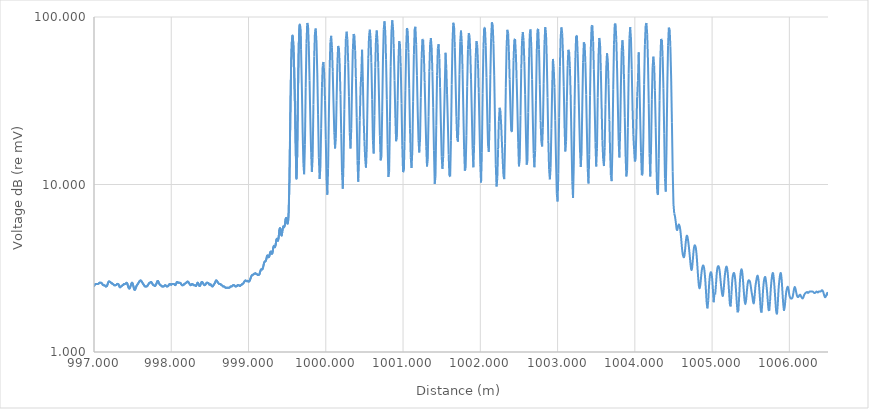
| Category | Series 0 |
|---|---|
| 996.8 | 2.493 |
| 996.81 | 2.464 |
| 996.82 | 2.464 |
| 996.83 | 2.464 |
| 996.84 | 2.477 |
| 996.85 | 2.506 |
| 996.86 | 2.506 |
| 996.87 | 2.493 |
| 996.88 | 2.464 |
| 996.89 | 2.464 |
| 996.9 | 2.464 |
| 996.91 | 2.464 |
| 996.92 | 2.464 |
| 996.93 | 2.464 |
| 996.94 | 2.464 |
| 996.95 | 2.464 |
| 996.96 | 2.477 |
| 996.97 | 2.519 |
| 996.98 | 2.535 |
| 996.99 | 2.493 |
| 997.0 | 2.477 |
| 997.01 | 2.519 |
| 997.02 | 2.548 |
| 997.03 | 2.548 |
| 997.04 | 2.548 |
| 997.05 | 2.548 |
| 997.06 | 2.561 |
| 997.07 | 2.59 |
| 997.08 | 2.59 |
| 997.09 | 2.59 |
| 997.1 | 2.577 |
| 997.11 | 2.535 |
| 997.12 | 2.506 |
| 997.13 | 2.506 |
| 997.14 | 2.493 |
| 997.15 | 2.464 |
| 997.16 | 2.464 |
| 997.17 | 2.49 |
| 997.18 | 2.574 |
| 997.19 | 2.632 |
| 997.2 | 2.632 |
| 997.21 | 2.619 |
| 997.22 | 2.59 |
| 997.23 | 2.577 |
| 997.24 | 2.548 |
| 997.25 | 2.535 |
| 997.26 | 2.506 |
| 997.27 | 2.506 |
| 997.28 | 2.506 |
| 997.29 | 2.519 |
| 997.3 | 2.548 |
| 997.31 | 2.548 |
| 997.32 | 2.522 |
| 997.33 | 2.451 |
| 997.34 | 2.435 |
| 997.35 | 2.464 |
| 997.36 | 2.477 |
| 997.37 | 2.506 |
| 997.38 | 2.519 |
| 997.39 | 2.548 |
| 997.4 | 2.548 |
| 997.41 | 2.561 |
| 997.42 | 2.59 |
| 997.43 | 2.564 |
| 997.44 | 2.48 |
| 997.45 | 2.409 |
| 997.46 | 2.394 |
| 997.47 | 2.449 |
| 997.48 | 2.532 |
| 997.49 | 2.59 |
| 997.5 | 2.564 |
| 997.51 | 2.467 |
| 997.52 | 2.367 |
| 997.53 | 2.352 |
| 997.54 | 2.407 |
| 997.55 | 2.477 |
| 997.56 | 2.519 |
| 997.57 | 2.561 |
| 997.58 | 2.603 |
| 997.59 | 2.645 |
| 997.6 | 2.673 |
| 997.61 | 2.66 |
| 997.62 | 2.619 |
| 997.63 | 2.577 |
| 997.64 | 2.535 |
| 997.65 | 2.493 |
| 997.66 | 2.464 |
| 997.67 | 2.464 |
| 997.68 | 2.464 |
| 997.69 | 2.477 |
| 997.7 | 2.519 |
| 997.71 | 2.561 |
| 997.72 | 2.59 |
| 997.73 | 2.603 |
| 997.74 | 2.619 |
| 997.75 | 2.577 |
| 997.76 | 2.535 |
| 997.77 | 2.506 |
| 997.78 | 2.493 |
| 997.79 | 2.477 |
| 997.8 | 2.519 |
| 997.81 | 2.574 |
| 997.82 | 2.645 |
| 997.83 | 2.647 |
| 997.84 | 2.577 |
| 997.85 | 2.535 |
| 997.86 | 2.506 |
| 997.87 | 2.493 |
| 997.88 | 2.464 |
| 997.89 | 2.464 |
| 997.9 | 2.464 |
| 997.91 | 2.477 |
| 997.92 | 2.506 |
| 997.93 | 2.493 |
| 997.94 | 2.464 |
| 997.95 | 2.464 |
| 997.96 | 2.477 |
| 997.97 | 2.519 |
| 997.98 | 2.548 |
| 997.99 | 2.535 |
| 998.0 | 2.519 |
| 998.01 | 2.548 |
| 998.02 | 2.548 |
| 998.03 | 2.548 |
| 998.04 | 2.535 |
| 998.05 | 2.506 |
| 998.06 | 2.532 |
| 998.07 | 2.603 |
| 998.08 | 2.619 |
| 998.09 | 2.59 |
| 998.1 | 2.59 |
| 998.11 | 2.59 |
| 998.12 | 2.577 |
| 998.13 | 2.535 |
| 998.14 | 2.506 |
| 998.15 | 2.506 |
| 998.16 | 2.519 |
| 998.17 | 2.548 |
| 998.18 | 2.561 |
| 998.19 | 2.59 |
| 998.2 | 2.603 |
| 998.21 | 2.632 |
| 998.22 | 2.619 |
| 998.23 | 2.577 |
| 998.24 | 2.535 |
| 998.25 | 2.506 |
| 998.26 | 2.519 |
| 998.27 | 2.548 |
| 998.28 | 2.535 |
| 998.29 | 2.506 |
| 998.3 | 2.506 |
| 998.31 | 2.493 |
| 998.32 | 2.477 |
| 998.33 | 2.532 |
| 998.34 | 2.59 |
| 998.35 | 2.564 |
| 998.36 | 2.493 |
| 998.37 | 2.477 |
| 998.38 | 2.532 |
| 998.39 | 2.603 |
| 998.4 | 2.619 |
| 998.41 | 2.577 |
| 998.42 | 2.535 |
| 998.43 | 2.506 |
| 998.44 | 2.519 |
| 998.45 | 2.561 |
| 998.46 | 2.59 |
| 998.47 | 2.59 |
| 998.48 | 2.577 |
| 998.49 | 2.535 |
| 998.5 | 2.519 |
| 998.51 | 2.535 |
| 998.52 | 2.493 |
| 998.53 | 2.464 |
| 998.54 | 2.477 |
| 998.55 | 2.519 |
| 998.56 | 2.561 |
| 998.57 | 2.616 |
| 998.58 | 2.673 |
| 998.59 | 2.66 |
| 998.6 | 2.619 |
| 998.61 | 2.577 |
| 998.62 | 2.548 |
| 998.63 | 2.548 |
| 998.64 | 2.535 |
| 998.65 | 2.506 |
| 998.66 | 2.493 |
| 998.67 | 2.464 |
| 998.68 | 2.464 |
| 998.69 | 2.451 |
| 998.7 | 2.422 |
| 998.71 | 2.422 |
| 998.72 | 2.422 |
| 998.73 | 2.422 |
| 998.74 | 2.422 |
| 998.75 | 2.422 |
| 998.76 | 2.435 |
| 998.77 | 2.464 |
| 998.78 | 2.464 |
| 998.79 | 2.477 |
| 998.8 | 2.506 |
| 998.81 | 2.506 |
| 998.82 | 2.493 |
| 998.83 | 2.464 |
| 998.84 | 2.464 |
| 998.85 | 2.477 |
| 998.86 | 2.506 |
| 998.87 | 2.506 |
| 998.88 | 2.493 |
| 998.89 | 2.477 |
| 998.9 | 2.506 |
| 998.91 | 2.519 |
| 998.92 | 2.548 |
| 998.93 | 2.561 |
| 998.94 | 2.603 |
| 998.95 | 2.645 |
| 998.96 | 2.673 |
| 998.97 | 2.66 |
| 998.98 | 2.645 |
| 998.99 | 2.66 |
| 999.0 | 2.632 |
| 999.01 | 2.645 |
| 999.02 | 2.7 |
| 999.03 | 2.783 |
| 999.04 | 2.854 |
| 999.05 | 2.883 |
| 999.06 | 2.896 |
| 999.07 | 2.924 |
| 999.08 | 2.938 |
| 999.09 | 2.953 |
| 999.1 | 2.924 |
| 999.11 | 2.911 |
| 999.12 | 2.883 |
| 999.13 | 2.883 |
| 999.14 | 2.909 |
| 999.15 | 3.006 |
| 999.16 | 3.105 |
| 999.17 | 3.121 |
| 999.18 | 3.118 |
| 999.19 | 3.228 |
| 999.2 | 3.382 |
| 999.21 | 3.468 |
| 999.22 | 3.481 |
| 999.23 | 3.576 |
| 999.24 | 3.746 |
| 999.25 | 3.764 |
| 999.26 | 3.678 |
| 999.27 | 3.743 |
| 999.28 | 3.926 |
| 999.29 | 3.973 |
| 999.3 | 3.861 |
| 999.31 | 3.908 |
| 999.32 | 4.203 |
| 999.33 | 4.308 |
| 999.34 | 4.222 |
| 999.35 | 4.339 |
| 999.36 | 4.663 |
| 999.37 | 4.742 |
| 999.38 | 4.611 |
| 999.39 | 4.836 |
| 999.4 | 5.372 |
| 999.41 | 5.472 |
| 999.42 | 5.079 |
| 999.43 | 4.967 |
| 999.44 | 5.356 |
| 999.45 | 5.618 |
| 999.46 | 5.56 |
| 999.47 | 5.73 |
| 999.48 | 6.209 |
| 999.49 | 6.295 |
| 999.5 | 5.887 |
| 999.51 | 5.882 |
| 999.52 | 6.889 |
| 999.53 | 10.874 |
| 999.54 | 23.853 |
| 999.55 | 47.519 |
| 999.56 | 69.925 |
| 999.57 | 77.616 |
| 999.58 | 68.782 |
| 999.59 | 50.474 |
| 999.6 | 31.41 |
| 999.61 | 17.273 |
| 999.62 | 10.812 |
| 999.63 | 15.132 |
| 999.64 | 35.092 |
| 999.65 | 66.45 |
| 999.66 | 89.12 |
| 999.67 | 86.847 |
| 999.68 | 64.112 |
| 999.69 | 38.317 |
| 999.7 | 21.149 |
| 999.71 | 13.317 |
| 999.72 | 11.507 |
| 999.73 | 17.409 |
| 999.74 | 37.817 |
| 999.75 | 69.475 |
| 999.76 | 92.161 |
| 999.77 | 89.847 |
| 999.78 | 67.213 |
| 999.79 | 41.771 |
| 999.8 | 24.473 |
| 999.81 | 15.566 |
| 999.82 | 11.897 |
| 999.83 | 14.47 |
| 999.84 | 30.051 |
| 999.85 | 58.102 |
| 999.86 | 81.612 |
| 999.87 | 85.411 |
| 999.88 | 69.977 |
| 999.89 | 46.348 |
| 999.9 | 26.039 |
| 999.91 | 14.543 |
| 999.92 | 10.78 |
| 999.93 | 12.561 |
| 999.94 | 21.661 |
| 999.95 | 37.775 |
| 999.96 | 51.342 |
| 999.97 | 53.895 |
| 999.98 | 45.665 |
| 999.99 | 31.667 |
| 1000.0 | 18.594 |
| 1000.01 | 10.796 |
| 1000.02 | 8.688 |
| 1000.03 | 12.435 |
| 1000.04 | 26.008 |
| 1000.05 | 49.799 |
| 1000.06 | 71.478 |
| 1000.07 | 77.187 |
| 1000.08 | 65.927 |
| 1000.09 | 47.132 |
| 1000.1 | 30.597 |
| 1000.11 | 20.49 |
| 1000.12 | 16.397 |
| 1000.13 | 18.787 |
| 1000.14 | 31.871 |
| 1000.15 | 52.938 |
| 1000.16 | 67.203 |
| 1000.17 | 65.432 |
| 1000.18 | 51.664 |
| 1000.19 | 34.402 |
| 1000.2 | 20.181 |
| 1000.21 | 11.839 |
| 1000.22 | 9.423 |
| 1000.23 | 13.628 |
| 1000.24 | 28.1 |
| 1000.25 | 52.26 |
| 1000.26 | 74.117 |
| 1000.27 | 81.745 |
| 1000.28 | 73.068 |
| 1000.29 | 53.581 |
| 1000.3 | 33.395 |
| 1000.31 | 20.424 |
| 1000.32 | 16.382 |
| 1000.33 | 21.661 |
| 1000.34 | 39.232 |
| 1000.35 | 63.644 |
| 1000.36 | 79.106 |
| 1000.37 | 77.462 |
| 1000.38 | 62.822 |
| 1000.39 | 43 |
| 1000.4 | 25.176 |
| 1000.41 | 13.965 |
| 1000.42 | 10.388 |
| 1000.43 | 13.879 |
| 1000.44 | 24.146 |
| 1000.45 | 37.713 |
| 1000.46 | 46.089 |
| 1000.47 | 63.821 |
| 1000.48 | 41.321 |
| 1000.49 | 24.572 |
| 1000.5 | 18.105 |
| 1000.51 | 14.318 |
| 1000.52 | 12.611 |
| 1000.53 | 16.267 |
| 1000.54 | 31.518 |
| 1000.55 | 56.387 |
| 1000.56 | 77.514 |
| 1000.57 | 84.031 |
| 1000.58 | 74.151 |
| 1000.59 | 53.549 |
| 1000.6 | 32.166 |
| 1000.61 | 18.254 |
| 1000.62 | 15.294 |
| 1000.63 | 25.832 |
| 1000.64 | 50.074 |
| 1000.65 | 75.283 |
| 1000.66 | 83.157 |
| 1000.67 | 70.689 |
| 1000.68 | 49.724 |
| 1000.69 | 31.345 |
| 1000.7 | 19.546 |
| 1000.71 | 13.931 |
| 1000.72 | 14.661 |
| 1000.73 | 27.417 |
| 1000.74 | 55.427 |
| 1000.75 | 84.347 |
| 1000.76 | 94.355 |
| 1000.77 | 81.253 |
| 1000.78 | 55.874 |
| 1000.79 | 32.124 |
| 1000.8 | 17.294 |
| 1000.81 | 11.091 |
| 1000.82 | 11.926 |
| 1000.83 | 23.73 |
| 1000.84 | 50.741 |
| 1000.85 | 81.35 |
| 1000.86 | 95.723 |
| 1000.87 | 87.49 |
| 1000.88 | 65.139 |
| 1000.89 | 41.787 |
| 1000.9 | 25.626 |
| 1000.91 | 18.121 |
| 1000.92 | 19.018 |
| 1000.93 | 31.698 |
| 1000.94 | 54.601 |
| 1000.95 | 71.774 |
| 1000.96 | 69.127 |
| 1000.97 | 50.78 |
| 1000.98 | 30.443 |
| 1000.99 | 17.132 |
| 1001.0 | 11.86 |
| 1001.01 | 11.96 |
| 1001.02 | 18.032 |
| 1001.03 | 36.225 |
| 1001.04 | 64.962 |
| 1001.05 | 85.819 |
| 1001.06 | 83.149 |
| 1001.07 | 61.468 |
| 1001.08 | 37.336 |
| 1001.09 | 21.52 |
| 1001.1 | 14.465 |
| 1001.11 | 12.54 |
| 1001.12 | 15.872 |
| 1001.13 | 31.222 |
| 1001.14 | 59.862 |
| 1001.15 | 84.679 |
| 1001.16 | 87.396 |
| 1001.17 | 68.85 |
| 1001.18 | 44.538 |
| 1001.19 | 27.067 |
| 1001.2 | 18.395 |
| 1001.21 | 15.532 |
| 1001.22 | 18.712 |
| 1001.23 | 33.058 |
| 1001.24 | 56.481 |
| 1001.25 | 73.659 |
| 1001.26 | 73.076 |
| 1001.27 | 58.518 |
| 1001.28 | 40.542 |
| 1001.29 | 26.049 |
| 1001.3 | 16.944 |
| 1001.31 | 12.809 |
| 1001.32 | 14.161 |
| 1001.33 | 25.367 |
| 1001.34 | 47.449 |
| 1001.35 | 68.492 |
| 1001.36 | 74.82 |
| 1001.37 | 65.32 |
| 1001.38 | 47.297 |
| 1001.39 | 28.96 |
| 1001.4 | 16.018 |
| 1001.41 | 10.085 |
| 1001.42 | 11.201 |
| 1001.43 | 22.6 |
| 1001.44 | 44.724 |
| 1001.45 | 64.865 |
| 1001.46 | 68.848 |
| 1001.47 | 56.559 |
| 1001.48 | 37.893 |
| 1001.49 | 22.66 |
| 1001.5 | 14.643 |
| 1001.51 | 12.399 |
| 1001.52 | 14.755 |
| 1001.53 | 23.963 |
| 1001.54 | 38.583 |
| 1001.55 | 61.1 |
| 1001.56 | 49.406 |
| 1001.57 | 34.635 |
| 1001.58 | 23.121 |
| 1001.59 | 15.105 |
| 1001.6 | 11.253 |
| 1001.61 | 11.162 |
| 1001.62 | 18.236 |
| 1001.63 | 39.528 |
| 1001.64 | 71.005 |
| 1001.65 | 92.456 |
| 1001.66 | 88.913 |
| 1001.67 | 65.843 |
| 1001.68 | 40.974 |
| 1001.69 | 25.401 |
| 1001.7 | 18.861 |
| 1001.71 | 18.029 |
| 1001.72 | 24.93 |
| 1001.73 | 45.176 |
| 1001.74 | 71.371 |
| 1001.75 | 82.956 |
| 1001.76 | 71.455 |
| 1001.77 | 48.379 |
| 1001.78 | 28.215 |
| 1001.79 | 16.536 |
| 1001.8 | 12.096 |
| 1001.81 | 12.501 |
| 1001.82 | 19.682 |
| 1001.83 | 38.471 |
| 1001.84 | 63.955 |
| 1001.85 | 80.09 |
| 1001.86 | 77.666 |
| 1001.87 | 61.805 |
| 1001.88 | 42.582 |
| 1001.89 | 26.635 |
| 1001.9 | 16.478 |
| 1001.91 | 12.658 |
| 1001.92 | 17.15 |
| 1001.93 | 33.753 |
| 1001.94 | 57.396 |
| 1001.95 | 71.808 |
| 1001.96 | 68.351 |
| 1001.97 | 52.864 |
| 1001.98 | 35.257 |
| 1001.99 | 21.431 |
| 1002.0 | 13.105 |
| 1002.01 | 10.265 |
| 1002.02 | 15.487 |
| 1002.03 | 34.813 |
| 1002.04 | 64.677 |
| 1002.05 | 86.389 |
| 1002.06 | 86.374 |
| 1002.07 | 67.668 |
| 1002.08 | 43.583 |
| 1002.09 | 25.801 |
| 1002.1 | 17.211 |
| 1002.11 | 15.655 |
| 1002.12 | 23.102 |
| 1002.13 | 45.121 |
| 1002.14 | 74.815 |
| 1002.15 | 92.987 |
| 1002.16 | 89.724 |
| 1002.17 | 69.802 |
| 1002.18 | 44.525 |
| 1002.19 | 24.242 |
| 1002.2 | 13.225 |
| 1002.21 | 9.718 |
| 1002.22 | 10.916 |
| 1002.23 | 16.201 |
| 1002.24 | 23.884 |
| 1002.25 | 28.704 |
| 1002.26 | 27.54 |
| 1002.27 | 22.647 |
| 1002.28 | 17.613 |
| 1002.29 | 13.85 |
| 1002.3 | 11.261 |
| 1002.31 | 10.767 |
| 1002.32 | 17.498 |
| 1002.33 | 38 |
| 1002.34 | 66.376 |
| 1002.35 | 83.829 |
| 1002.36 | 80.037 |
| 1002.37 | 61.915 |
| 1002.38 | 42.339 |
| 1002.39 | 28.364 |
| 1002.4 | 20.835 |
| 1002.41 | 20.644 |
| 1002.42 | 32.42 |
| 1002.43 | 55.108 |
| 1002.44 | 73.353 |
| 1002.45 | 73.963 |
| 1002.46 | 60.393 |
| 1002.47 | 43.123 |
| 1002.48 | 28.223 |
| 1002.49 | 17.904 |
| 1002.5 | 12.83 |
| 1002.51 | 14.057 |
| 1002.52 | 25.819 |
| 1002.53 | 49.274 |
| 1002.54 | 72.645 |
| 1002.55 | 81.348 |
| 1002.56 | 72.637 |
| 1002.57 | 54.012 |
| 1002.58 | 34.606 |
| 1002.59 | 20.372 |
| 1002.6 | 13.131 |
| 1002.61 | 13.808 |
| 1002.62 | 26.939 |
| 1002.63 | 53.821 |
| 1002.64 | 79.441 |
| 1002.65 | 84.347 |
| 1002.66 | 67.009 |
| 1002.67 | 42.409 |
| 1002.68 | 24.188 |
| 1002.69 | 15.336 |
| 1002.7 | 12.684 |
| 1002.71 | 15.963 |
| 1002.72 | 31.567 |
| 1002.73 | 60.231 |
| 1002.74 | 84.284 |
| 1002.75 | 84.849 |
| 1002.76 | 63.923 |
| 1002.77 | 39.368 |
| 1002.78 | 24.075 |
| 1002.79 | 18.076 |
| 1002.8 | 16.876 |
| 1002.81 | 21.837 |
| 1002.82 | 40.286 |
| 1002.83 | 68.769 |
| 1002.84 | 86.978 |
| 1002.85 | 80.589 |
| 1002.86 | 56.839 |
| 1002.87 | 33.029 |
| 1002.88 | 18.387 |
| 1002.89 | 12.289 |
| 1002.9 | 10.733 |
| 1002.91 | 12.582 |
| 1002.92 | 21.504 |
| 1002.93 | 37.668 |
| 1002.94 | 56.215 |
| 1002.95 | 49.494 |
| 1002.96 | 37.961 |
| 1002.97 | 24.038 |
| 1002.98 | 13.811 |
| 1002.99 | 8.821 |
| 1003.0 | 7.919 |
| 1003.01 | 11.58 |
| 1003.02 | 25.189 |
| 1003.03 | 50.712 |
| 1003.04 | 75.981 |
| 1003.05 | 86.722 |
| 1003.06 | 79.682 |
| 1003.07 | 60.202 |
| 1003.08 | 38.387 |
| 1003.09 | 22.676 |
| 1003.1 | 15.754 |
| 1003.11 | 17.99 |
| 1003.12 | 31.384 |
| 1003.13 | 51.227 |
| 1003.14 | 63.704 |
| 1003.15 | 61.834 |
| 1003.16 | 49.313 |
| 1003.17 | 32.809 |
| 1003.18 | 18.675 |
| 1003.19 | 10.424 |
| 1003.2 | 8.314 |
| 1003.21 | 13.246 |
| 1003.22 | 29.726 |
| 1003.23 | 56.162 |
| 1003.24 | 76.855 |
| 1003.25 | 77.558 |
| 1003.26 | 60.796 |
| 1003.27 | 39.917 |
| 1003.28 | 24.666 |
| 1003.29 | 16.29 |
| 1003.3 | 12.728 |
| 1003.31 | 15.422 |
| 1003.32 | 29.867 |
| 1003.33 | 53.636 |
| 1003.34 | 70.592 |
| 1003.35 | 69.14 |
| 1003.36 | 53.356 |
| 1003.37 | 34.426 |
| 1003.38 | 20.137 |
| 1003.39 | 12.433 |
| 1003.4 | 10.139 |
| 1003.41 | 15.1 |
| 1003.42 | 33.889 |
| 1003.43 | 64.428 |
| 1003.44 | 87.906 |
| 1003.45 | 89.227 |
| 1003.46 | 71.601 |
| 1003.47 | 48.372 |
| 1003.48 | 29.53 |
| 1003.49 | 17.802 |
| 1003.5 | 12.817 |
| 1003.51 | 16.465 |
| 1003.52 | 33.045 |
| 1003.53 | 58.568 |
| 1003.54 | 74.98 |
| 1003.55 | 68.9 |
| 1003.56 | 47.935 |
| 1003.57 | 28.631 |
| 1003.58 | 18.272 |
| 1003.59 | 14.169 |
| 1003.6 | 12.883 |
| 1003.61 | 16.572 |
| 1003.62 | 30.176 |
| 1003.63 | 49.65 |
| 1003.64 | 60.741 |
| 1003.65 | 55.281 |
| 1003.66 | 39.441 |
| 1003.67 | 24.433 |
| 1003.68 | 15.414 |
| 1003.69 | 11.321 |
| 1003.7 | 10.474 |
| 1003.71 | 16.497 |
| 1003.72 | 37.054 |
| 1003.73 | 68.27 |
| 1003.74 | 90.759 |
| 1003.75 | 91.374 |
| 1003.76 | 73.581 |
| 1003.77 | 49.593 |
| 1003.78 | 29.941 |
| 1003.79 | 18.272 |
| 1003.8 | 14.491 |
| 1003.81 | 20.67 |
| 1003.82 | 39.86 |
| 1003.83 | 63.28 |
| 1003.84 | 72.7 |
| 1003.85 | 62.391 |
| 1003.86 | 42.488 |
| 1003.87 | 25.006 |
| 1003.88 | 15.011 |
| 1003.89 | 11.175 |
| 1003.9 | 12.077 |
| 1003.91 | 21.92 |
| 1003.92 | 45.77 |
| 1003.93 | 74.53 |
| 1003.94 | 87.004 |
| 1003.95 | 73.96 |
| 1003.96 | 48.599 |
| 1003.97 | 29.018 |
| 1003.98 | 19.956 |
| 1003.99 | 16.206 |
| 1004.0 | 13.712 |
| 1004.01 | 14.12 |
| 1004.02 | 21.434 |
| 1004.03 | 33.534 |
| 1004.04 | 41.748 |
| 1004.05 | 61.497 |
| 1004.06 | 39.297 |
| 1004.07 | 24.08 |
| 1004.08 | 15.521 |
| 1004.09 | 11.361 |
| 1004.1 | 11.465 |
| 1004.11 | 18.706 |
| 1004.12 | 39.473 |
| 1004.13 | 68.468 |
| 1004.14 | 88.895 |
| 1004.15 | 92.077 |
| 1004.16 | 78.814 |
| 1004.17 | 54.669 |
| 1004.18 | 30.385 |
| 1004.19 | 15.317 |
| 1004.2 | 11.149 |
| 1004.21 | 16.74 |
| 1004.22 | 32.093 |
| 1004.23 | 50.189 |
| 1004.24 | 57.985 |
| 1004.25 | 51.311 |
| 1004.26 | 36.494 |
| 1004.27 | 21.986 |
| 1004.28 | 12.736 |
| 1004.29 | 8.879 |
| 1004.3 | 8.68 |
| 1004.31 | 14.363 |
| 1004.32 | 31.8 |
| 1004.33 | 57.02 |
| 1004.34 | 73.832 |
| 1004.35 | 73.168 |
| 1004.36 | 58.053 |
| 1004.37 | 37.31 |
| 1004.38 | 20.113 |
| 1004.39 | 10.846 |
| 1004.4 | 9.067 |
| 1004.41 | 16.541 |
| 1004.42 | 38.223 |
| 1004.43 | 67.796 |
| 1004.44 | 86.397 |
| 1004.45 | 84.53 |
| 1004.46 | 66.829 |
| 1004.47 | 43.254 |
| 1004.48 | 23.398 |
| 1004.49 | 11.97 |
| 1004.5 | 7.637 |
| 1004.51 | 6.708 |
| 1004.52 | 6.434 |
| 1004.53 | 5.95 |
| 1004.54 | 5.44 |
| 1004.55 | 5.359 |
| 1004.56 | 5.639 |
| 1004.57 | 5.785 |
| 1004.58 | 5.636 |
| 1004.59 | 5.278 |
| 1004.6 | 4.737 |
| 1004.61 | 4.174 |
| 1004.62 | 3.835 |
| 1004.63 | 3.693 |
| 1004.64 | 3.714 |
| 1004.65 | 4.057 |
| 1004.66 | 4.575 |
| 1004.67 | 4.917 |
| 1004.68 | 4.896 |
| 1004.69 | 4.606 |
| 1004.7 | 4.216 |
| 1004.71 | 3.785 |
| 1004.72 | 3.364 |
| 1004.73 | 3.108 |
| 1004.74 | 3.142 |
| 1004.75 | 3.513 |
| 1004.76 | 4.004 |
| 1004.77 | 4.29 |
| 1004.78 | 4.321 |
| 1004.79 | 4.159 |
| 1004.8 | 3.759 |
| 1004.81 | 3.228 |
| 1004.82 | 2.765 |
| 1004.83 | 2.467 |
| 1004.84 | 2.407 |
| 1004.85 | 2.569 |
| 1004.86 | 2.89 |
| 1004.87 | 3.144 |
| 1004.88 | 3.272 |
| 1004.89 | 3.262 |
| 1004.9 | 3.084 |
| 1004.91 | 2.752 |
| 1004.92 | 2.333 |
| 1004.93 | 1.967 |
| 1004.94 | 1.821 |
| 1004.95 | 2.022 |
| 1004.96 | 2.469 |
| 1004.97 | 2.822 |
| 1004.98 | 2.979 |
| 1004.99 | 2.969 |
| 1005.0 | 2.765 |
| 1005.01 | 2.375 |
| 1005.02 | 1.983 |
| 1005.03 | 2.214 |
| 1005.04 | 2.206 |
| 1005.05 | 2.522 |
| 1005.06 | 2.943 |
| 1005.07 | 3.2 |
| 1005.08 | 3.257 |
| 1005.09 | 3.205 |
| 1005.1 | 2.985 |
| 1005.11 | 2.663 |
| 1005.12 | 2.397 |
| 1005.13 | 2.214 |
| 1005.14 | 2.167 |
| 1005.15 | 2.371 |
| 1005.16 | 2.721 |
| 1005.17 | 3.001 |
| 1005.18 | 3.2 |
| 1005.19 | 3.218 |
| 1005.2 | 3.027 |
| 1005.21 | 2.666 |
| 1005.22 | 2.261 |
| 1005.23 | 1.937 |
| 1005.24 | 1.871 |
| 1005.25 | 2.201 |
| 1005.26 | 2.637 |
| 1005.27 | 2.878 |
| 1005.28 | 2.964 |
| 1005.29 | 2.912 |
| 1005.3 | 2.679 |
| 1005.31 | 2.303 |
| 1005.32 | 1.952 |
| 1005.33 | 1.725 |
| 1005.34 | 1.759 |
| 1005.35 | 2.13 |
| 1005.36 | 2.635 |
| 1005.37 | 2.988 |
| 1005.38 | 3.119 |
| 1005.39 | 2.998 |
| 1005.4 | 2.679 |
| 1005.41 | 2.316 |
| 1005.42 | 2.033 |
| 1005.43 | 1.931 |
| 1005.44 | 2.038 |
| 1005.45 | 2.303 |
| 1005.46 | 2.556 |
| 1005.47 | 2.671 |
| 1005.48 | 2.671 |
| 1005.49 | 2.632 |
| 1005.5 | 2.48 |
| 1005.51 | 2.297 |
| 1005.52 | 2.159 |
| 1005.53 | 2.004 |
| 1005.54 | 1.957 |
| 1005.55 | 2.148 |
| 1005.56 | 2.444 |
| 1005.57 | 2.64 |
| 1005.58 | 2.794 |
| 1005.59 | 2.854 |
| 1005.6 | 2.705 |
| 1005.61 | 2.399 |
| 1005.62 | 2.065 |
| 1005.63 | 1.782 |
| 1005.64 | 1.719 |
| 1005.65 | 1.965 |
| 1005.66 | 2.358 |
| 1005.67 | 2.64 |
| 1005.68 | 2.781 |
| 1005.69 | 2.786 |
| 1005.7 | 2.593 |
| 1005.71 | 2.329 |
| 1005.72 | 2.036 |
| 1005.73 | 1.795 |
| 1005.74 | 1.761 |
| 1005.75 | 2.007 |
| 1005.76 | 2.399 |
| 1005.77 | 2.708 |
| 1005.78 | 2.92 |
| 1005.79 | 2.941 |
| 1005.8 | 2.692 |
| 1005.81 | 2.344 |
| 1005.82 | 1.994 |
| 1005.83 | 1.74 |
| 1005.84 | 1.678 |
| 1005.85 | 1.937 |
| 1005.86 | 2.358 |
| 1005.87 | 2.666 |
| 1005.88 | 2.891 |
| 1005.89 | 2.954 |
| 1005.9 | 2.708 |
| 1005.91 | 2.303 |
| 1005.92 | 1.952 |
| 1005.93 | 1.764 |
| 1005.94 | 1.858 |
| 1005.95 | 2.08 |
| 1005.96 | 2.292 |
| 1005.97 | 2.405 |
| 1005.98 | 2.449 |
| 1005.99 | 2.355 |
| 1006.0 | 2.185 |
| 1006.01 | 2.114 |
| 1006.02 | 2.086 |
| 1006.03 | 2.086 |
| 1006.04 | 2.112 |
| 1006.05 | 2.222 |
| 1006.06 | 2.376 |
| 1006.07 | 2.449 |
| 1006.08 | 2.381 |
| 1006.09 | 2.256 |
| 1006.1 | 2.156 |
| 1006.11 | 2.127 |
| 1006.12 | 2.14 |
| 1006.13 | 2.182 |
| 1006.14 | 2.198 |
| 1006.15 | 2.156 |
| 1006.16 | 2.114 |
| 1006.17 | 2.086 |
| 1006.18 | 2.112 |
| 1006.19 | 2.182 |
| 1006.2 | 2.224 |
| 1006.21 | 2.253 |
| 1006.22 | 2.266 |
| 1006.23 | 2.282 |
| 1006.24 | 2.253 |
| 1006.25 | 2.266 |
| 1006.26 | 2.295 |
| 1006.27 | 2.295 |
| 1006.28 | 2.295 |
| 1006.29 | 2.295 |
| 1006.3 | 2.295 |
| 1006.31 | 2.282 |
| 1006.32 | 2.253 |
| 1006.33 | 2.253 |
| 1006.34 | 2.266 |
| 1006.35 | 2.295 |
| 1006.36 | 2.282 |
| 1006.37 | 2.266 |
| 1006.38 | 2.295 |
| 1006.39 | 2.295 |
| 1006.4 | 2.295 |
| 1006.41 | 2.308 |
| 1006.42 | 2.337 |
| 1006.43 | 2.324 |
| 1006.44 | 2.269 |
| 1006.45 | 2.185 |
| 1006.46 | 2.127 |
| 1006.47 | 2.14 |
| 1006.48 | 2.195 |
| 1006.49 | 2.253 |
| 1006.5 | 2.227 |
| 1006.51 | 2.169 |
| 1006.52 | 2.169 |
| 1006.53 | 2.182 |
| 1006.54 | 2.237 |
| 1006.55 | 2.295 |
| 1006.56 | 2.282 |
| 1006.57 | 2.253 |
| 1006.58 | 2.266 |
| 1006.59 | 2.295 |
| 1006.6 | 2.295 |
| 1006.61 | 2.295 |
| 1006.62 | 2.308 |
| 1006.63 | 2.35 |
| 1006.64 | 2.378 |
| 1006.65 | 2.365 |
| 1006.66 | 2.31 |
| 1006.67 | 2.227 |
| 1006.68 | 2.182 |
| 1006.69 | 2.224 |
| 1006.7 | 2.292 |
| 1006.71 | 2.405 |
| 1006.72 | 2.462 |
| 1006.73 | 2.449 |
| 1006.74 | 2.394 |
| 1006.75 | 2.31 |
| 1006.76 | 2.24 |
| 1006.77 | 2.211 |
| 1006.78 | 2.211 |